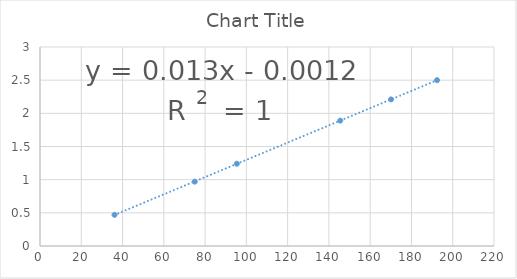
| Category | Series 0 |
|---|---|
| 36.1 | 0.47 |
| 75.0 | 0.97 |
| 95.4 | 1.24 |
| 145.5 | 1.89 |
| 170.1 | 2.21 |
| 192.4 | 2.5 |